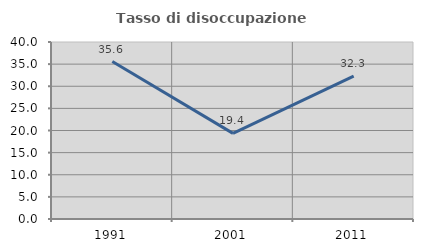
| Category | Tasso di disoccupazione giovanile  |
|---|---|
| 1991.0 | 35.577 |
| 2001.0 | 19.355 |
| 2011.0 | 32.308 |